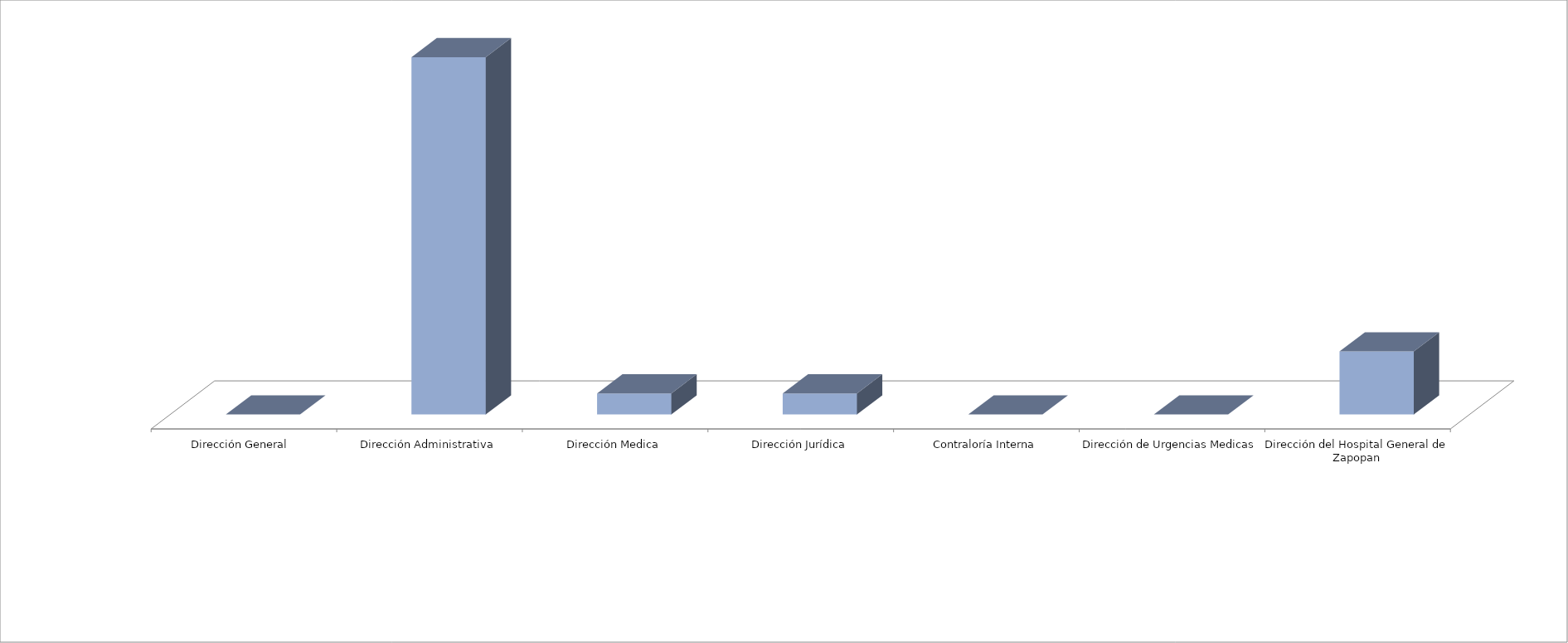
| Category | Series 0 | Series 1 |
|---|---|---|
| Dirección General  |  | 0 |
| Dirección Administrativa |  | 17 |
| Dirección Medica |  | 1 |
| Dirección Jurídica |  | 1 |
| Contraloría Interna |  | 0 |
| Dirección de Urgencias Medicas |  | 0 |
| Dirección del Hospital General de Zapopan |  | 3 |